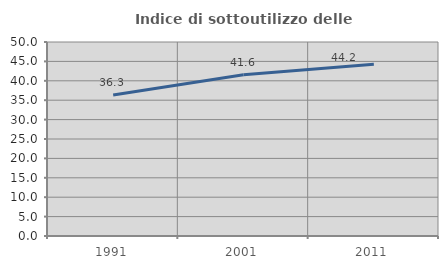
| Category | Indice di sottoutilizzo delle abitazioni  |
|---|---|
| 1991.0 | 36.332 |
| 2001.0 | 41.556 |
| 2011.0 | 44.247 |